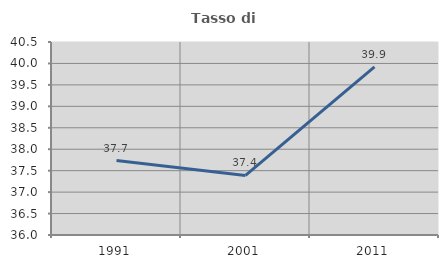
| Category | Tasso di occupazione   |
|---|---|
| 1991.0 | 37.735 |
| 2001.0 | 37.39 |
| 2011.0 | 39.921 |